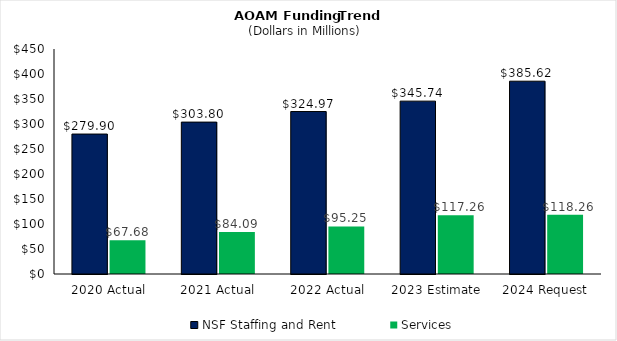
| Category | NSF Staffing and Rent | Services |
|---|---|---|
| 2020 Actual | 279.901 | 67.682 |
| 2021 Actual | 303.803 | 84.088 |
| 2022 Actual | 324.966 | 95.247 |
| 2023 Estimate | 345.74 | 117.26 |
| 2024 Request | 385.619 | 118.255 |